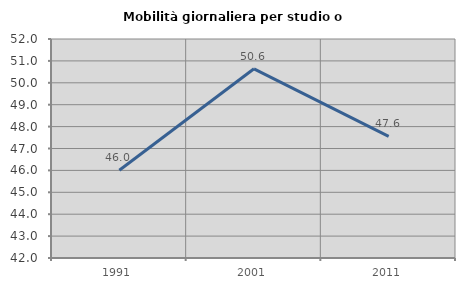
| Category | Mobilità giornaliera per studio o lavoro |
|---|---|
| 1991.0 | 46.009 |
| 2001.0 | 50.639 |
| 2011.0 | 47.552 |